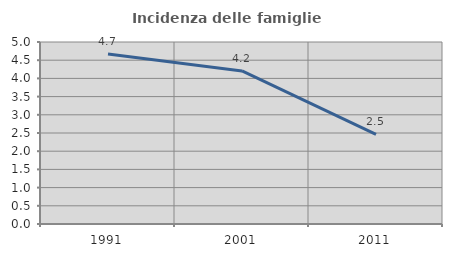
| Category | Incidenza delle famiglie numerose |
|---|---|
| 1991.0 | 4.671 |
| 2001.0 | 4.205 |
| 2011.0 | 2.464 |